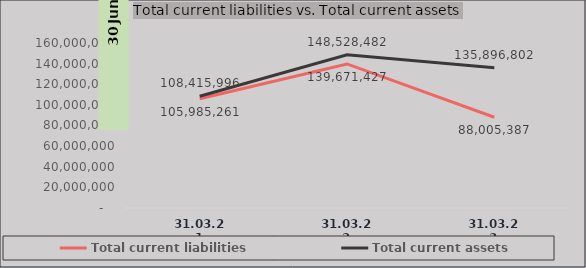
| Category | Total current liabilities | Total current assets |
|---|---|---|
| 31.03.21 | 105985260.952 | 108415996.085 |
| 31.03.22 | 139671426.922 | 148528481.681 |
| 31.03.23 | 88005387.102 | 135896802.133 |